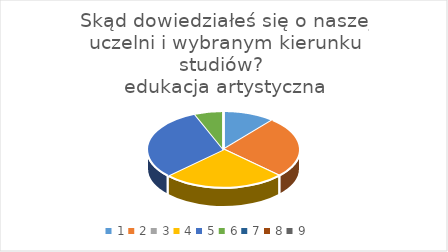
| Category | Series 0 |
|---|---|
| 0 | 9 |
| 1 | 21 |
| 2 | 0 |
| 3 | 21 |
| 4 | 25 |
| 5 | 5 |
| 6 | 0 |
| 7 | 0 |
| 8 | 0 |